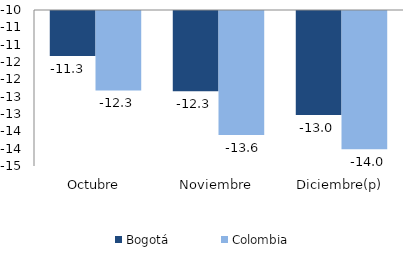
| Category | Bogotá | Colombia |
|---|---|---|
| Octubre | -11.296 | -12.291 |
| Noviembre | -12.318 | -13.58 |
| Diciembre(p) | -13 | -13.99 |